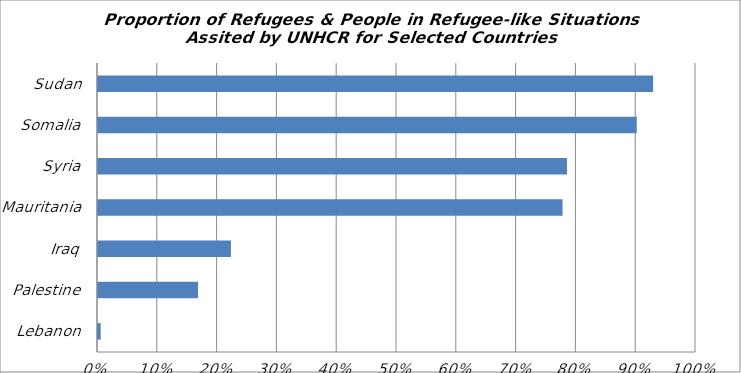
| Category | Series 0 |
|---|---|
| Lebanon | 0.004 |
| Palestine | 0.167 |
| Iraq | 0.222 |
| Mauritania | 0.777 |
| Syria | 0.784 |
| Somalia | 0.901 |
| Sudan | 0.928 |